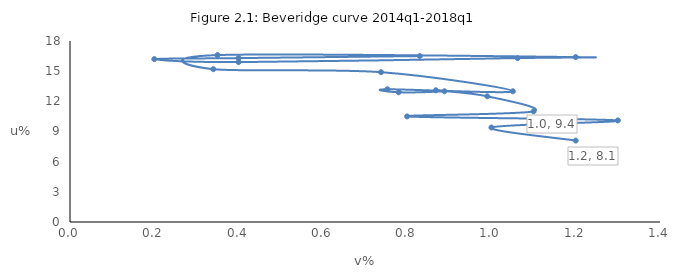
| Category | Unemployment rate |
|---|---|
| 0.4 | 16.5 |
| 0.2 | 16.3 |
| 0.4 | 16.2 |
| 1.0622755726537254 | 15.9 |
| 1.2 | 16.3 |
| 0.35 | 16.4 |
| 0.34 | 16.6 |
| 0.7380688931634313 | 15.2 |
| 1.050916365513681 | 14.9 |
| 0.7531258067497665 | 13 |
| 0.78 | 13.2 |
| 0.8885456784813591 | 12.9 |
| 0.8681469626862016 | 13 |
| 0.9901889240249737 | 13.1 |
| 1.1 | 12.5 |
| 0.8 | 11 |
| 1.3 | 10.5 |
| 1.0 | 10.1 |
| 1.2 | 9.4 |
| 1.4 | 8.1 |